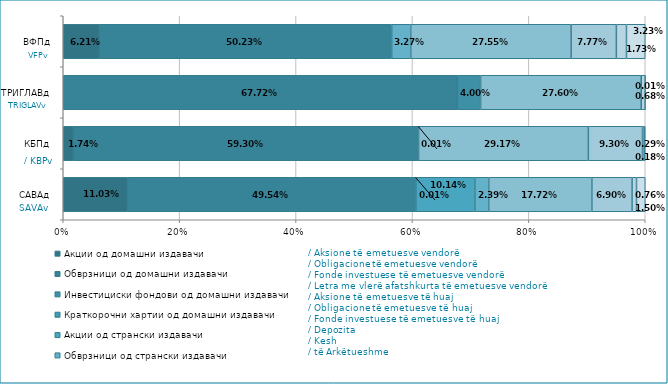
| Category | Акции од домашни издавачи  | Обврзници од домашни издавачи  | Инвестициски фондови од домашни издавачи   | Краткорочни хартии од домашни издавачи   | Акции од странски издавачи   | Обврзници од странски издавачи  | Инвестициски фондови од странски издавчи  | Депозити | Парични средства | Побарувања |
|---|---|---|---|---|---|---|---|---|---|---|
| САВАд | 0.11 | 0.495 | 0 | 0 | 0.101 | 0.024 | 0.177 | 0.069 | 0.008 | 0.015 |
| КБПд | 0.017 | 0.593 | 0 | 0 | 0 | 0 | 0.292 | 0.093 | 0.003 | 0.002 |
| ТРИГЛАВд | 0 | 0.677 | 0.04 | 0 | 0 | 0 | 0.276 | 0 | 0.007 | 0 |
| ВФПд | 0.062 | 0.502 | 0 | 0 | 0 | 0.033 | 0.276 | 0.078 | 0.017 | 0.032 |